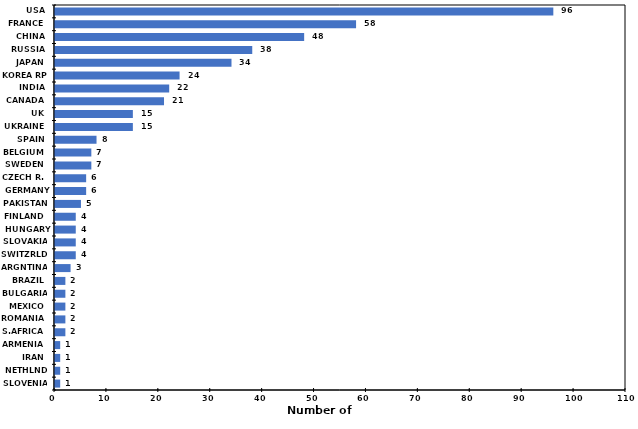
| Category | Country |
|---|---|
| USA | 96 |
| FRANCE | 58 |
| CHINA | 48 |
| RUSSIA | 38 |
| JAPAN | 34 |
| KOREA RP | 24 |
| INDIA | 22 |
| CANADA | 21 |
| UK | 15 |
| UKRAINE | 15 |
| SPAIN | 8 |
| BELGIUM | 7 |
| SWEDEN | 7 |
| CZECH R. | 6 |
| GERMANY | 6 |
| PAKISTAN | 5 |
| FINLAND | 4 |
| HUNGARY | 4 |
| SLOVAKIA | 4 |
| SWITZRLD | 4 |
| ARGNTINA | 3 |
| BRAZIL | 2 |
| BULGARIA | 2 |
| MEXICO | 2 |
| ROMANIA | 2 |
| S.AFRICA | 2 |
| ARMENIA | 1 |
| IRAN | 1 |
| NETHLNDS | 1 |
| SLOVENIA | 1 |